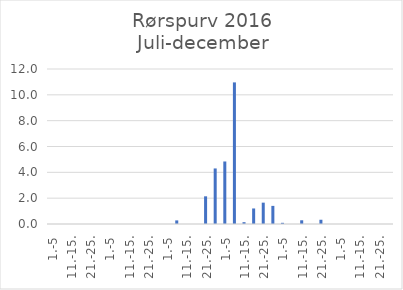
| Category | Series 0 |
|---|---|
| 1.-5 | 0 |
| 6.-10. | 0 |
| 11.-15. | 0 |
| 16.-20. | 0 |
| 21.-25. | 0 |
| 26.-31. | 0 |
| 1.-5 | 0 |
| 6.-10. | 0 |
| 11.-15. | 0 |
| 16.-20. | 0 |
| 21.-25. | 0 |
| 26.-31. | 0 |
| 1.-5 | 0 |
| 6.-10. | 0.279 |
| 11.-15. | 0 |
| 16.-20. | 0 |
| 21.-25. | 2.143 |
| 26.-30. | 4.301 |
| 1.-5 | 4.84 |
| 6.-10. | 10.963 |
| 11.-15. | 0.141 |
| 16.-20. | 1.203 |
| 21.-25. | 1.653 |
| 26.-31. | 1.403 |
| 1.-5 | 0.091 |
| 6.-10. | 0 |
| 11.-15. | 0.289 |
| 16.-20. | 0 |
| 21.-25. | 0.329 |
| 26.-30. | 0 |
| 1.-5 | 0 |
| 6.-10. | 0 |
| 11.-15. | 0 |
| 16.-20. | 0 |
| 21.-25. | 0 |
| 26.-31. | 0 |